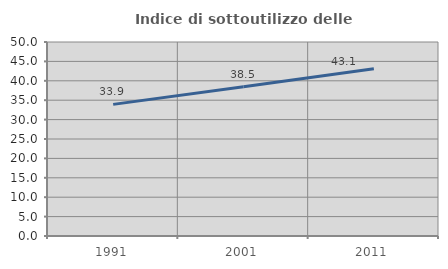
| Category | Indice di sottoutilizzo delle abitazioni  |
|---|---|
| 1991.0 | 33.927 |
| 2001.0 | 38.458 |
| 2011.0 | 43.101 |